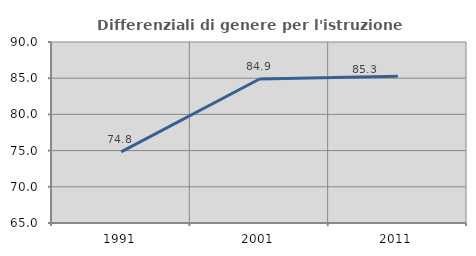
| Category | Differenziali di genere per l'istruzione superiore |
|---|---|
| 1991.0 | 74.822 |
| 2001.0 | 84.886 |
| 2011.0 | 85.285 |